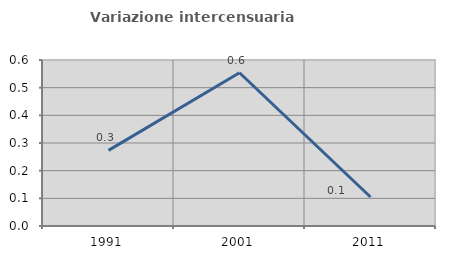
| Category | Variazione intercensuaria annua |
|---|---|
| 1991.0 | 0.273 |
| 2001.0 | 0.554 |
| 2011.0 | 0.105 |